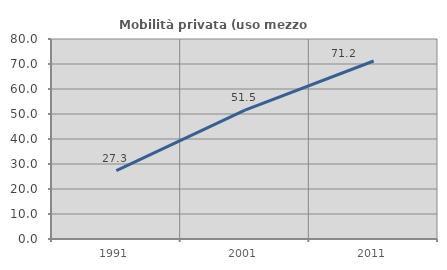
| Category | Mobilità privata (uso mezzo privato) |
|---|---|
| 1991.0 | 27.313 |
| 2001.0 | 51.532 |
| 2011.0 | 71.208 |